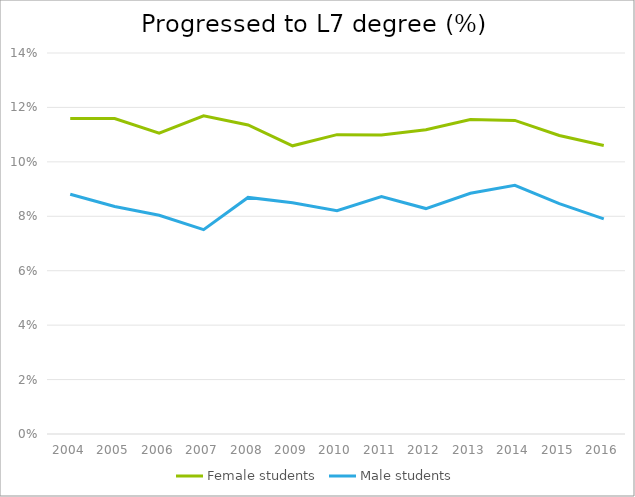
| Category | Female students | Male students |
|---|---|---|
| 2004.0 | 0.116 | 0.088 |
| 2005.0 | 0.116 | 0.084 |
| 2006.0 | 0.111 | 0.08 |
| 2007.0 | 0.117 | 0.075 |
| 2008.0 | 0.114 | 0.087 |
| 2009.0 | 0.106 | 0.085 |
| 2010.0 | 0.11 | 0.082 |
| 2011.0 | 0.11 | 0.087 |
| 2012.0 | 0.112 | 0.083 |
| 2013.0 | 0.116 | 0.088 |
| 2014.0 | 0.115 | 0.091 |
| 2015.0 | 0.11 | 0.085 |
| 2016.0 | 0.106 | 0.079 |